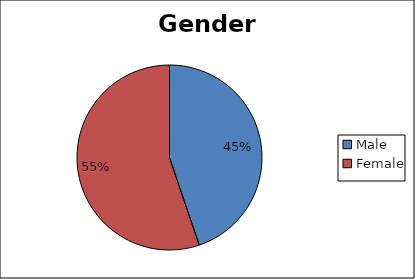
| Category | Series 0 |
|---|---|
| Male | 0.448 |
| Female | 0.552 |